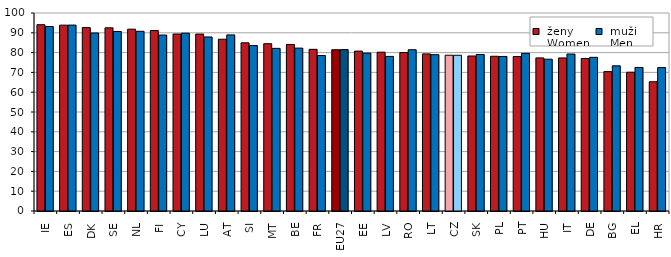
| Category |  ženy 
 Women |  muži 
 Men |
|---|---|---|
| IE | 94.089 | 93.169 |
| ES | 93.866 | 93.897 |
| DK | 92.622 | 89.9 |
| SE | 92.511 | 90.67 |
| NL | 91.84 | 90.766 |
| FI | 91.125 | 88.855 |
| CY | 89.379 | 89.803 |
| LU | 89.352 | 87.907 |
| AT | 86.752 | 88.943 |
| SI | 84.934 | 83.546 |
| MT | 84.494 | 82.134 |
| BE | 84.11 | 82.272 |
| FR | 81.645 | 78.511 |
| EU27 | 81.448 | 81.508 |
| EE | 80.751 | 79.742 |
| LV | 80.213 | 78.074 |
| RO | 80.021 | 81.451 |
| LT | 79.355 | 78.95 |
| CZ | 78.671 | 78.653 |
| SK | 78.284 | 79.038 |
| PL | 78.15 | 78.054 |
| PT | 78 | 79.645 |
| HU | 77.336 | 76.67 |
| IT | 77.308 | 79.273 |
| DE | 77.009 | 77.606 |
| BG | 70.395 | 73.323 |
| EL | 70.095 | 72.5 |
| HR | 65.275 | 72.431 |